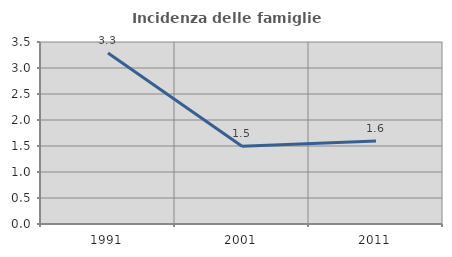
| Category | Incidenza delle famiglie numerose |
|---|---|
| 1991.0 | 3.289 |
| 2001.0 | 1.497 |
| 2011.0 | 1.598 |